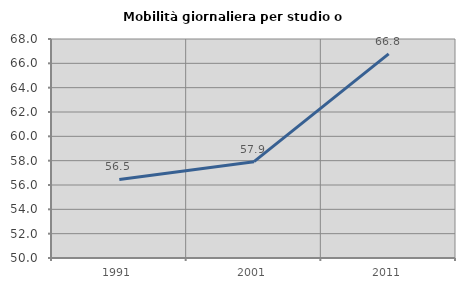
| Category | Mobilità giornaliera per studio o lavoro |
|---|---|
| 1991.0 | 56.455 |
| 2001.0 | 57.915 |
| 2011.0 | 66.78 |